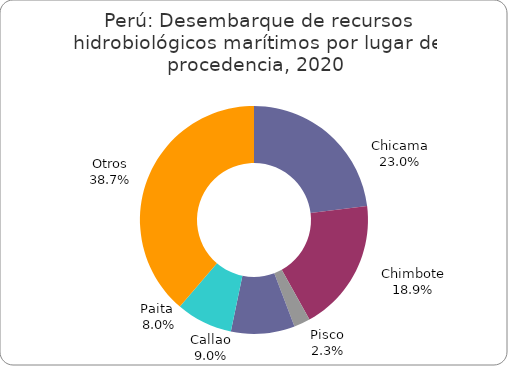
| Category | Series 0 |
|---|---|
| Chicama | 1303981.8 |
| Chimbote | 1069699.35 |
| Pisco | 130569.65 |
| Callao | 511816.37 |
| Paita  | 453446.88 |
| Otros | 2193360.05 |